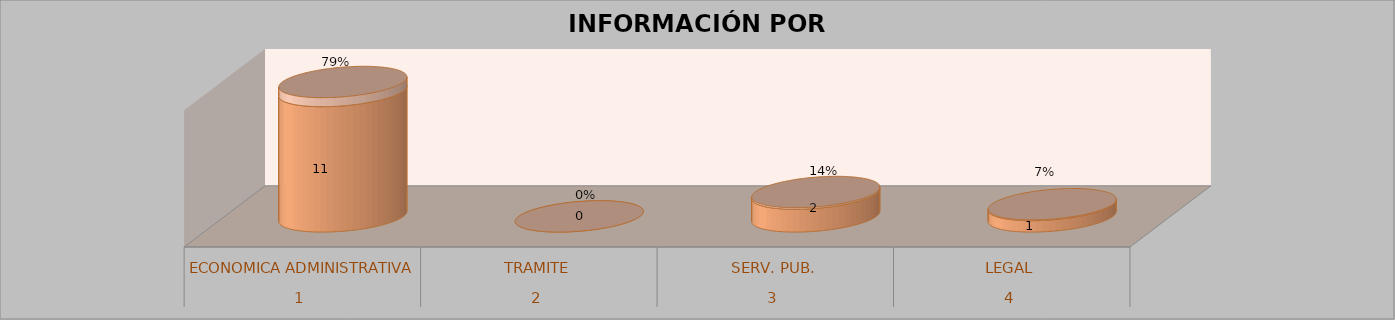
| Category | Series 0 | Series 1 | Series 2 | Series 3 |
|---|---|---|---|---|
| 0 |  |  | 11 | 0.79 |
| 1 |  |  | 0 | 0 |
| 2 |  |  | 2 | 0.14 |
| 3 |  |  | 1 | 0.07 |